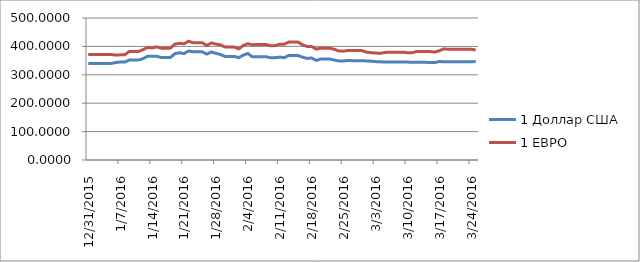
| Category | 1 Доллар США | 1 ЕВРО |
|---|---|---|
| 12/31/15 | 339.47 | 371.316 |
| 1/1/16 | 340.01 | 371.46 |
| 1/2/16 | 340.01 | 371.46 |
| 1/3/16 | 340.01 | 371.46 |
| 1/4/16 | 340.01 | 371.46 |
| 1/5/16 | 340.01 | 371.46 |
| 1/6/16 | 343.14 | 369.46 |
| 1/7/16 | 345.01 | 370.23 |
| 1/8/16 | 345.01 | 370.23 |
| 1/9/16 | 351.88 | 382.32 |
| 1/10/16 | 351.88 | 382.32 |
| 1/11/16 | 351.88 | 382.32 |
| 1/12/16 | 356.88 | 388.46 |
| 1/13/16 | 365.07 | 396.17 |
| 1/14/16 | 364.89 | 394.67 |
| 1/15/16 | 365.23 | 398.32 |
| 1/16/16 | 360.9 | 393.63 |
| 1/17/16 | 360.9 | 393.63 |
| 1/18/16 | 360.9 | 393.63 |
| 1/19/16 | 374.31 | 407.96 |
| 1/20/16 | 377.7 | 410.79 |
| 1/21/16 | 374.6 | 409.29 |
| 1/22/16 | 383.91 | 418.23 |
| 1/23/16 | 381.16 | 412.95 |
| 1/24/16 | 381.16 | 412.95 |
| 1/25/16 | 381.16 | 412.95 |
| 1/26/16 | 372.89 | 403.28 |
| 1/27/16 | 380.3 | 412.13 |
| 1/28/16 | 375.49 | 408.27 |
| 1/29/16 | 371.55 | 405.32 |
| 1/30/16 | 364.79 | 397.88 |
| 1/31/16 | 364.79 | 397.88 |
| 2/1/16 | 364.79 | 397.88 |
| 2/2/16 | 360.45 | 391.27 |
| 2/3/16 | 369.15 | 403 |
| 2/4/16 | 375.25 | 409.62 |
| 2/5/16 | 363.34 | 405.6 |
| 2/6/16 | 363.72 | 406.97 |
| 2/7/16 | 363.72 | 406.97 |
| 2/8/16 | 363.72 | 406.97 |
| 2/9/16 | 359.89 | 402.03 |
| 2/10/16 | 360.37 | 402.93 |
| 2/11/16 | 362.23 | 407.83 |
| 2/12/16 | 360.31 | 407.73 |
| 2/13/16 | 368.17 | 415.52 |
| 2/14/16 | 368.17 | 415.52 |
| 2/15/16 | 368.17 | 415.52 |
| 2/16/16 | 362.1 | 405.7 |
| 2/17/16 | 357.71 | 399.92 |
| 2/18/16 | 359.23 | 399.61 |
| 2/19/16 | 350.58 | 390.37 |
| 2/20/16 | 355.45 | 393.8 |
| 2/21/16 | 355.45 | 393.8 |
| 2/22/16 | 355.45 | 393.8 |
| 2/23/16 | 351.77 | 389.59 |
| 2/24/16 | 348.69 | 383.66 |
| 2/25/16 | 348.96 | 383.3 |
| 2/26/16 | 350.25 | 385.77 |
| 2/27/16 | 349.82 | 385.36 |
| 2/28/16 | 349.82 | 385.36 |
| 2/29/16 | 349.82 | 385.36 |
| 3/1/16 | 348.78 | 380.14 |
| 3/2/16 | 347.96 | 378.02 |
| 3/3/16 | 346.56 | 376.64 |
| 3/4/16 | 345.65 | 375.65 |
| 3/5/16 | 345.22 | 378.4 |
| 3/6/16 | 345.02 | 379.66 |
| 3/7/16 | 345.02 | 379.66 |
| 3/8/16 | 345.02 | 379.66 |
| 3/9/16 | 345.02 | 379.66 |
| 3/10/16 | 344.8 | 377.9 |
| 3/11/16 | 344.19 | 377.47 |
| 3/12/16 | 343.92 | 381.96 |
| 3/13/16 | 343.92 | 381.96 |
| 3/14/16 | 343.92 | 381.96 |
| 3/15/16 | 343.32 | 381.77 |
| 3/16/16 | 343.23 | 380.23 |
| 3/17/16 | 346.61 | 384.49 |
| 3/18/16 | 346.05 | 391.45 |
| 3/19/16 | 345.73 | 389.78 |
| 3/20/16 | 345.73 | 389.78 |
| 3/21/16 | 345.73 | 389.78 |
| 3/22/16 | 345.73 | 389.78 |
| 3/23/16 | 345.73 | 389.78 |
| 3/24/16 | 345.73 | 389.78 |
| 3/25/16 | 346.97 | 387.53 |